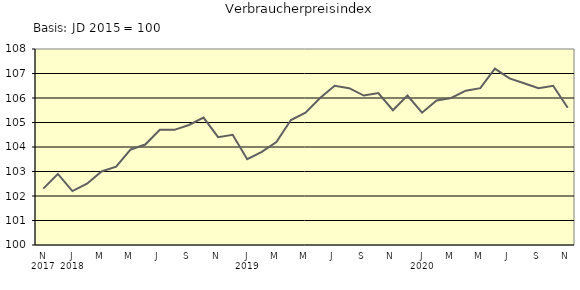
| Category | Series 0 |
|---|---|
| 0 | 102.3 |
| 1 | 102.9 |
| 2 | 102.2 |
| 3 | 102.5 |
| 4 | 103 |
| 5 | 103.2 |
| 6 | 103.9 |
| 7 | 104.1 |
| 8 | 104.7 |
| 9 | 104.7 |
| 10 | 104.9 |
| 11 | 105.2 |
| 12 | 104.4 |
| 13 | 104.5 |
| 14 | 103.5 |
| 15 | 103.8 |
| 16 | 104.2 |
| 17 | 105.1 |
| 18 | 105.4 |
| 19 | 106 |
| 20 | 106.5 |
| 21 | 106.4 |
| 22 | 106.1 |
| 23 | 106.2 |
| 24 | 105.5 |
| 25 | 106.1 |
| 26 | 105.4 |
| 27 | 105.9 |
| 28 | 106 |
| 29 | 106.3 |
| 30 | 106.4 |
| 31 | 107.2 |
| 32 | 106.8 |
| 33 | 106.6 |
| 34 | 106.4 |
| 35 | 106.5 |
| 36 | 105.6 |